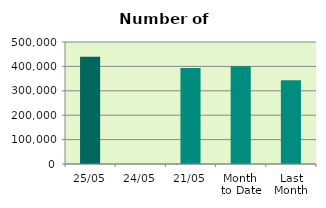
| Category | Series 0 |
|---|---|
| 25/05 | 439584 |
| 24/05 | 0 |
| 21/05 | 393316 |
| Month 
to Date | 400761.067 |
| Last
Month | 343067.2 |